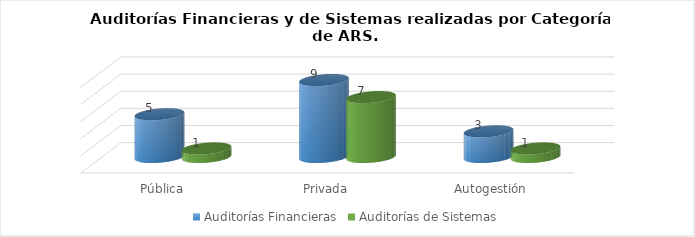
| Category | Auditorías Financieras | Auditorías de Sistemas |
|---|---|---|
| Pública | 5 | 1 |
| Privada | 9 | 7 |
| Autogestión | 3 | 1 |